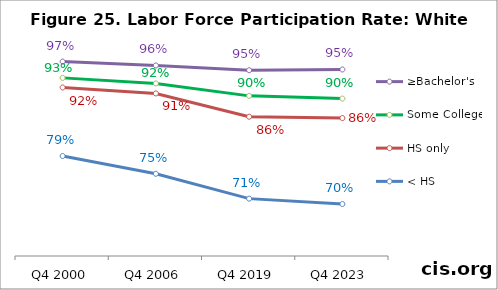
| Category | ≥Bachelor's | Some College | HS only | < HS |
|---|---|---|---|---|
| Q4 2000 | 0.965 | 0.935 | 0.916 | 0.788 |
| Q4 2006 | 0.958 | 0.924 | 0.905 | 0.754 |
| Q4 2019 | 0.949 | 0.901 | 0.862 | 0.708 |
| Q4 2023 | 0.95 | 0.896 | 0.859 | 0.698 |